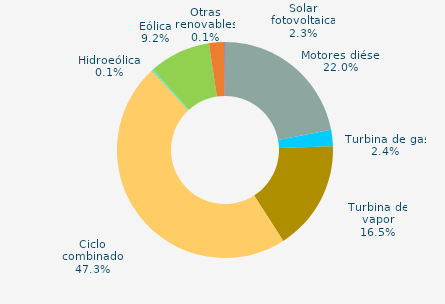
| Category | Series 0 |
|---|---|
| Motores diésel | 22.015 |
| Turbina de gas | 2.418 |
| Turbina de vapor | 16.495 |
| Ciclo combinado | 47.255 |
| Cogeneración | 0 |
| Hidráulica | 0.045 |
| Hidroeólica | 0.144 |
| Eólica | 9.235 |
| Solar fotovoltaica | 2.28 |
| Otras renovables | 0.113 |